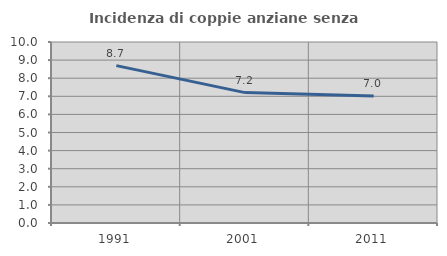
| Category | Incidenza di coppie anziane senza figli  |
|---|---|
| 1991.0 | 8.696 |
| 2001.0 | 7.203 |
| 2011.0 | 7.018 |